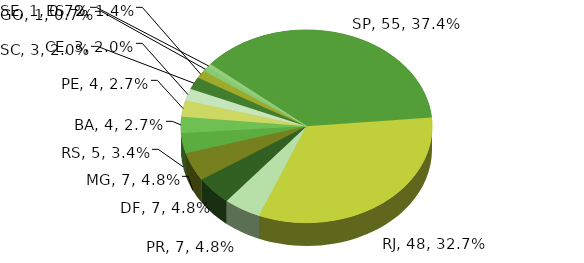
| Category | Quantidade Obras |
|---|---|
| SP | 55 |
| RJ | 48 |
| PR | 7 |
| DF | 7 |
| MG | 7 |
| RS | 5 |
| BA | 4 |
| PE | 4 |
| CE | 3 |
| SC | 3 |
| ES | 2 |
| GO | 1 |
| SE | 1 |